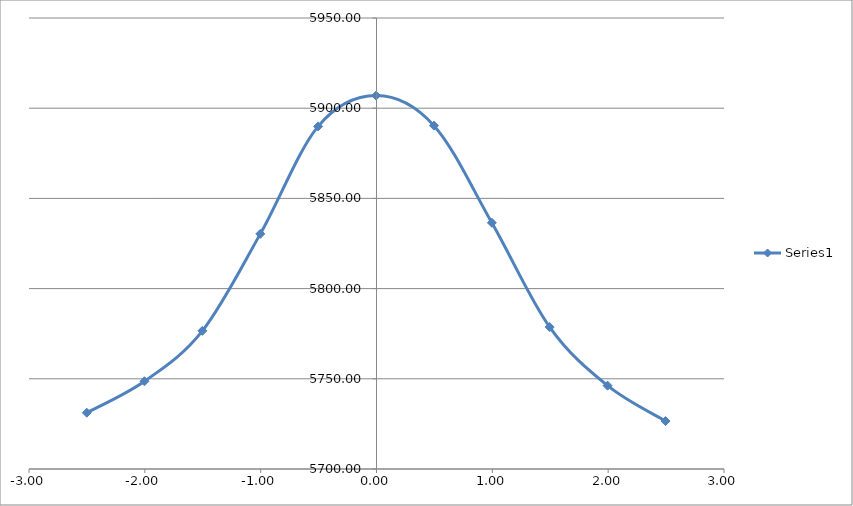
| Category | Series 0 |
|---|---|
| -2.5010000000000003 | 5731.189 |
| -2.003 | 5748.636 |
| -1.5030000000000001 | 5776.588 |
| -1.0030000000000001 | 5830.338 |
| -0.5040000000000004 | 5889.905 |
| -0.004000000000000448 | 5906.977 |
| 0.49599999999999955 | 5890.332 |
| 0.9959999999999996 | 5836.493 |
| 1.495 | 5778.669 |
| 1.995 | 5746.197 |
| 2.495 | 5726.559 |